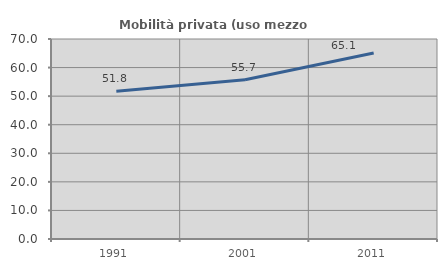
| Category | Mobilità privata (uso mezzo privato) |
|---|---|
| 1991.0 | 51.752 |
| 2001.0 | 55.728 |
| 2011.0 | 65.106 |